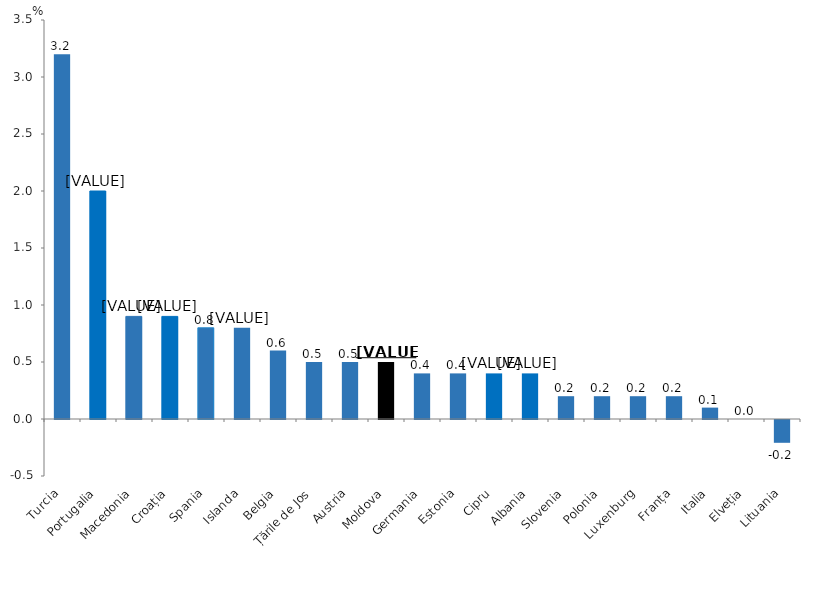
| Category | Series 0 |
|---|---|
| Turcia | 3.2 |
| Portugalia | 2 |
| Macedonia | 0.9 |
| Croația | 0.9 |
| Spania | 0.8 |
| Islanda | 0.8 |
| Belgia | 0.6 |
| Țările de Jos | 0.5 |
| Austria | 0.5 |
| Moldova | 0.5 |
| Germania | 0.4 |
| Estonia | 0.4 |
| Cipru | 0.4 |
| Albania | 0.4 |
| Slovenia | 0.2 |
| Polonia | 0.2 |
| Luxenburg | 0.2 |
| Franța | 0.2 |
| Italia | 0.1 |
| Elveția | 0 |
| Lituania | -0.2 |